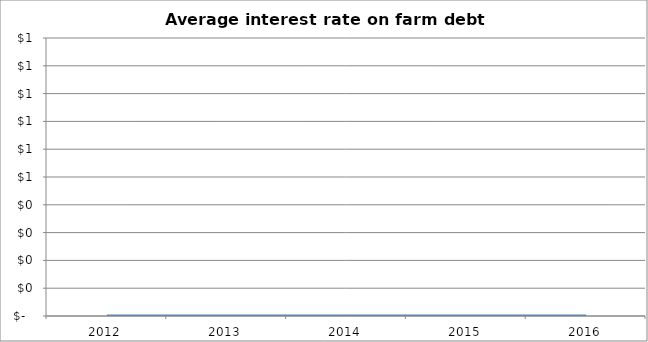
| Category | Capital debt repayment capacity [(I+K+L+M-N)-F] |
|---|---|
| 2012.0 | 0 |
| 2013.0 | 0 |
| 2014.0 | 0 |
| 2015.0 | 0 |
| 2016.0 | 0 |